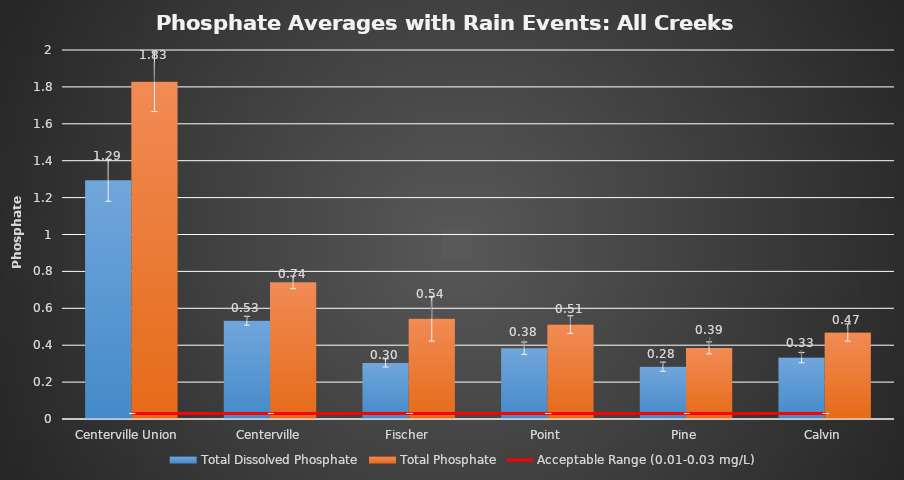
| Category | Total Dissolved Phosphate | Total Phosphate |
|---|---|---|
| Centerville Union  | 1.294 | 1.828 |
| Centerville | 0.533 | 0.741 |
| Fischer | 0.304 | 0.543 |
| Point | 0.384 | 0.512 |
| Pine | 0.284 | 0.385 |
| Calvin | 0.333 | 0.469 |